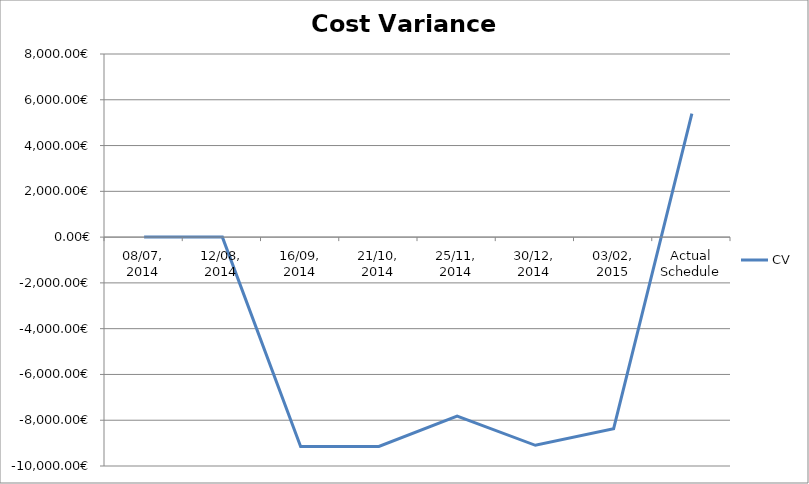
| Category | CV |
|---|---|
| 08/07, 2014 | 0.001 |
| 12/08, 2014 | 0 |
| 16/09, 2014 | -9146.4 |
| 21/10, 2014 | -9146.4 |
| 25/11, 2014 | -7816.88 |
| 30/12, 2014 | -9095.76 |
| 03/02, 2015 | -8371.12 |
| Actual Schedule | 5397.04 |